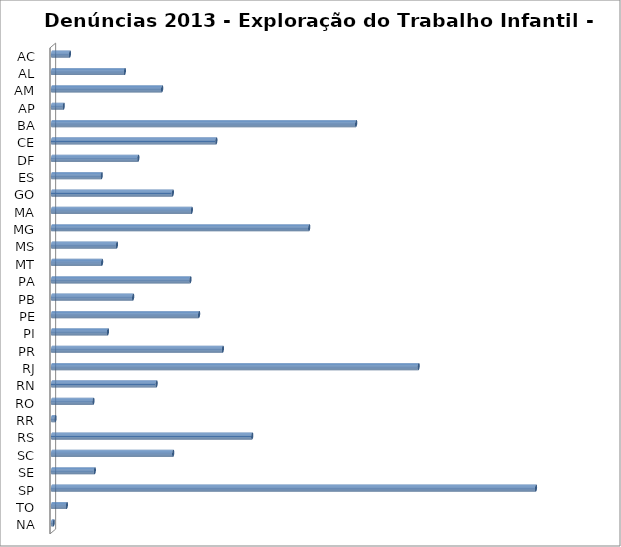
| Category | Series 0 |
|---|---|
| AC | 52 |
| AL | 211 |
| AM | 319 |
| AP | 34 |
| BA | 881 |
| CE | 476 |
| DF | 250 |
| ES | 144 |
| GO | 350 |
| MA | 405 |
| MG | 745 |
| MS | 188 |
| MT | 145 |
| PA | 401 |
| PB | 235 |
| PE | 426 |
| PI | 162 |
| PR | 495 |
| RJ | 1062 |
| RN | 303 |
| RO | 120 |
| RR | 10 |
| RS | 580 |
| SC | 351 |
| SE | 124 |
| SP | 1402 |
| TO | 43 |
| NA | 5 |